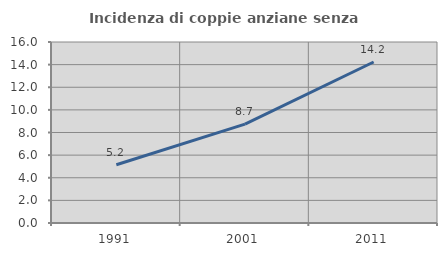
| Category | Incidenza di coppie anziane senza figli  |
|---|---|
| 1991.0 | 5.152 |
| 2001.0 | 8.741 |
| 2011.0 | 14.231 |